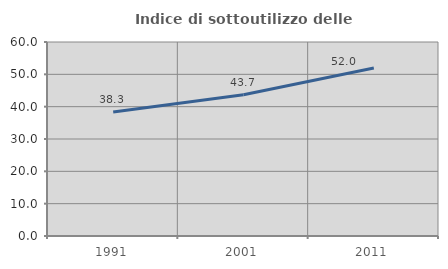
| Category | Indice di sottoutilizzo delle abitazioni  |
|---|---|
| 1991.0 | 38.318 |
| 2001.0 | 43.68 |
| 2011.0 | 51.952 |